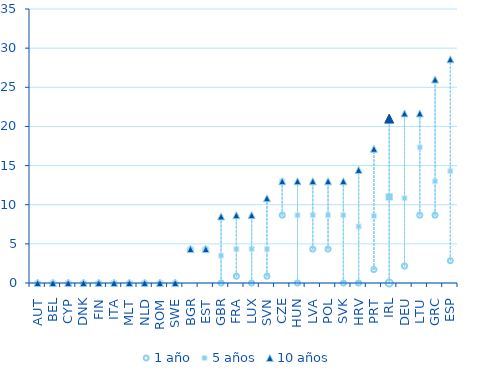
| Category | 1 año | 5 años | 10 años |
|---|---|---|---|
| AUT | 0 | 0 | 0 |
| BEL | 0 | 0 | 0 |
| CYP | 0 | 0 | 0 |
| DNK | 0 | 0 | 0 |
| FIN | 0 | 0 | 0 |
| ITA | 0 | 0 | 0 |
| MLT | 0 | 0 | 0 |
| NLD | 0 | 0 | 0 |
| ROM | 0 | 0 | 0 |
| SWE | 0 | 0 | 0 |
| BGR | 4.333 | 4.333 | 4.333 |
| EST | 4.333 | 4.333 | 4.333 |
| GBR | 0 | 3.5 | 8.5 |
| FRA | 0.867 | 4.333 | 8.667 |
| LUX | 0 | 4.333 | 8.667 |
| SVN | 0.867 | 4.333 | 10.833 |
| CZE | 8.667 | 13 | 13 |
| HUN | 0 | 8.667 | 13 |
| LVA | 4.333 | 8.667 | 13 |
| POL | 4.333 | 8.667 | 13 |
| SVK | 0 | 8.667 | 13 |
| HRV | 0 | 7.222 | 14.444 |
| PRT | 1.714 | 8.571 | 17.143 |
| IRL | 0 | 11 | 21 |
| DEU | 2.167 | 10.833 | 21.667 |
| LTU | 8.667 | 17.333 | 21.667 |
| GRC | 8.667 | 13 | 26 |
| ESP | 2.857 | 14.286 | 28.571 |